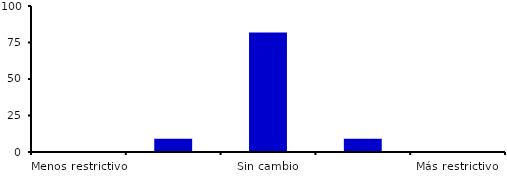
| Category | Series 0 |
|---|---|
| Menos restrictivo | 0 |
| Moderadamente menos restrictivo | 9.091 |
| Sin cambio | 81.818 |
| Moderadamente más restrictivo | 9.091 |
| Más restrictivo | 0 |